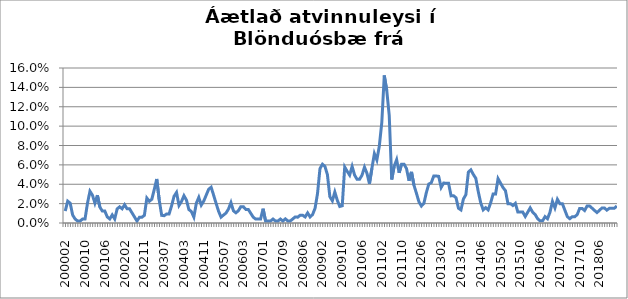
| Category | Series 0 |
|---|---|
| 200002 | 0.012 |
| 200003 | 0.023 |
| 200004 | 0.02 |
| 200005 | 0.008 |
| 200006 | 0.004 |
| 200007 | 0.002 |
| 200008 | 0.002 |
| 200009 | 0.004 |
| 200010 | 0.004 |
| 200011 | 0.02 |
| 200012 | 0.033 |
| 200101 | 0.029 |
| 200102 | 0.021 |
| 200103 | 0.029 |
| 200104 | 0.016 |
| 200105 | 0.012 |
| 200106 | 0.012 |
| 200107 | 0.006 |
| 200108 | 0.004 |
| 200109 | 0.008 |
| 200110 | 0.004 |
| 200111 | 0.015 |
| 200112 | 0.017 |
| 200201 | 0.015 |
| 200202 | 0.019 |
| 200203 | 0.015 |
| 200204 | 0.015 |
| 200205 | 0.01 |
| 200206 | 0.006 |
| 200208 | 0.002 |
| 200209 | 0.006 |
| 200210 | 0.006 |
| 200211 | 0.008 |
| 200212 | 0.026 |
| 200301 | 0.022 |
| 200302 | 0.024 |
| 200303 | 0.035 |
| 200304 | 0.045 |
| 200305 | 0.024 |
| 200306 | 0.008 |
| 200307 | 0.008 |
| 200308 | 0.009 |
| 200309 | 0.009 |
| 200310 | 0.018 |
| 200311 | 0.028 |
| 200312 | 0.032 |
| 200401 | 0.018 |
| 200402 | 0.022 |
| 200403 | 0.028 |
| 200404 | 0.024 |
| 200405 | 0.014 |
| 200406 | 0.012 |
| 200407 | 0.006 |
| 200408 | 0.02 |
| 200409 | 0.026 |
| 200410 | 0.018 |
| 200411 | 0.023 |
| 200412 | 0.029 |
| 200501 | 0.035 |
| 200502 | 0.037 |
| 200503 | 0.029 |
| 200504 | 0.02 |
| 200505 | 0.012 |
| 200506 | 0.006 |
| 200507 | 0.008 |
| 200508 | 0.01 |
| 200509 | 0.014 |
| 200510 | 0.021 |
| 200511 | 0.013 |
| 200512 | 0.011 |
| 200601 | 0.013 |
| 200602 | 0.017 |
| 200603 | 0.017 |
| 200604 | 0.014 |
| 200605 | 0.014 |
| 200606 | 0.01 |
| 200607 | 0.006 |
| 200608 | 0.004 |
| 200609 | 0.004 |
| 200612 | 0.004 |
| 200701 | 0.015 |
| 200702 | 0.002 |
| 200703 | 0.002 |
| 200704 | 0.002 |
| 200705 | 0.004 |
| 200706 | 0.002 |
| 200707 | 0.002 |
| 200708 | 0.004 |
| 200709 | 0.002 |
| 200711 | 0.004 |
| 200712 | 0.002 |
| 200801 | 0.002 |
| 200802 | 0.004 |
| 200803 | 0.006 |
| 200804 | 0.006 |
| 200805 | 0.008 |
| 200806 | 0.008 |
| 200807 | 0.006 |
| 200808 | 0.01 |
| 200809 | 0.006 |
| 200810 | 0.009 |
| 200811 | 0.015 |
| 200812 | 0.03 |
| 200901 | 0.056 |
| 200902 | 0.061 |
| 200903 | 0.058 |
| 200904 | 0.05 |
| 200905 | 0.027 |
| 200906 | 0.023 |
| 200907 | 0.032 |
| 200908 | 0.023 |
| 200909 | 0.017 |
| 200910 | 0.018 |
| 200911 | 0.058 |
| 200912 | 0.053 |
| 201001 | 0.049 |
| 201002 | 0.058 |
| 201003 | 0.049 |
| 201004 | 0.045 |
| 201005 | 0.045 |
| 201006 | 0.049 |
| 201007 | 0.058 |
| 201008 | 0.051 |
| 201009 | 0.041 |
| 201010 | 0.056 |
| 201011 | 0.072 |
| 201012 | 0.065 |
| 201101 | 0.079 |
| 201102 | 0.104 |
| 201103 | 0.152 |
| 201104 | 0.137 |
| 201105 | 0.111 |
| 201106 | 0.045 |
| 201107 | 0.059 |
| 201108 | 0.065 |
| 201109 | 0.052 |
| 201110 | 0.061 |
| 201111 | 0.061 |
| 201112 | 0.056 |
| 201201 | 0.044 |
| 201202 | 0.053 |
| 201203 | 0.039 |
| 201204 | 0.031 |
| 201205 | 0.022 |
| 201206 | 0.018 |
| 201207 | 0.02 |
| 201208 | 0.031 |
| 201209 | 0.04 |
| 201210 | 0.042 |
| 201211 | 0.048 |
| 201212 | 0.048 |
| 201301 | 0.048 |
| 201302 | 0.037 |
| 201303 | 0.041 |
| 201304 | 0.041 |
| 201305 | 0.041 |
| 201306 | 0.028 |
| 201307 | 0.028 |
| 201308 | 0.026 |
| 201309 | 0.015 |
| 201310 | 0.014 |
| 201311 | 0.025 |
| 201312 | 0.029 |
| 201401 | 0.053 |
| 201402 | 0.055 |
| 201403 | 0.05 |
| 201404 | 0.046 |
| 201405 | 0.032 |
| 201406 | 0.021 |
| 201407 | 0.014 |
| 201408 | 0.016 |
| 201409 | 0.014 |
| 201410 | 0.021 |
| 201411 | 0.03 |
| 201412 | 0.03 |
| 201501 | 0.046 |
| 201502 | 0.041 |
| 201503 | 0.037 |
| 201504 | 0.033 |
| 201505 | 0.02 |
| 201506 | 0.02 |
| 201507 | 0.018 |
| 201508 | 0.02 |
| 201509 | 0.011 |
| 201510 | 0.011 |
| 201511 | 0.011 |
| 201512 | 0.007 |
| 201601 | 0.011 |
| 201602 | 0.016 |
| 201603 | 0.011 |
| 201604 | 0.009 |
| 201605 | 0.004 |
| 201606 | 0.002 |
| 201607 | 0.002 |
| 201608 | 0.007 |
| 201609 | 0.004 |
| 201610 | 0.011 |
| 201611 | 0.022 |
| 201612 | 0.016 |
| 201701 | 0.024 |
| 201702 | 0.02 |
| 201703 | 0.02 |
| 201704 | 0.013 |
| 201705 | 0.007 |
| 201706 | 0.004 |
| 201707 | 0.006 |
| 201708 | 0.006 |
| 201709 | 0.009 |
| 201710 | 0.015 |
| 201711 | 0.015 |
| 201712 | 0.013 |
| 201801 | 0.018 |
| 201802 | 0.018 |
| 201803 | 0.015 |
| 201804 | 0.013 |
| 201805 | 0.011 |
| 201806 | 0.013 |
| 201807 | 0.016 |
| 201808 | 0.016 |
| 201809 | 0.013 |
| 201810 | 0.015 |
| 201811 | 0.015 |
| 201812 | 0.015 |
| 201901 | 0.018 |